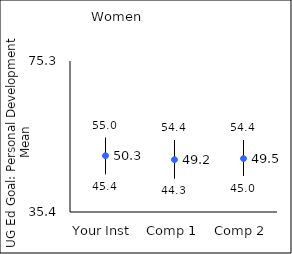
| Category | 25th percentile | 75th percentile | Mean |
|---|---|---|---|
| Your Inst | 45.4 | 55 | 50.27 |
| Comp 1 | 44.3 | 54.4 | 49.23 |
| Comp 2 | 45 | 54.4 | 49.52 |